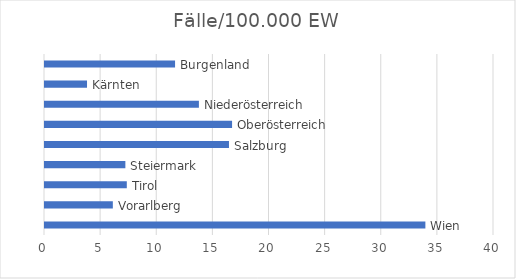
| Category | Fälle/100.000 EW |
|---|---|
| 0 | 33.887 |
| 1 | 6.044 |
| 2 | 7.288 |
| 3 | 7.16 |
| 4 | 16.39 |
| 5 | 16.666 |
| 6 | 13.711 |
| 7 | 3.744 |
| 8 | 11.587 |